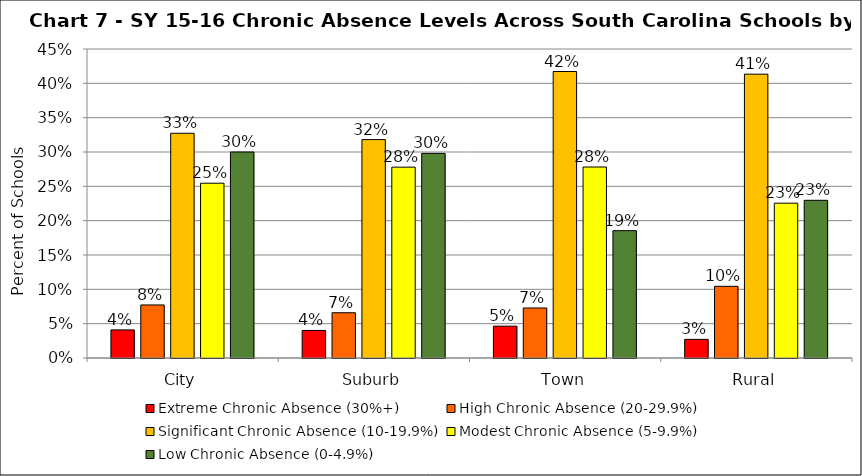
| Category | Extreme Chronic Absence (30%+) | High Chronic Absence (20-29.9%) | Significant Chronic Absence (10-19.9%) | Modest Chronic Absence (5-9.9%) | Low Chronic Absence (0-4.9%) |
|---|---|---|---|---|---|
| 0 | 0.041 | 0.077 | 0.327 | 0.255 | 0.3 |
| 1 | 0.04 | 0.066 | 0.318 | 0.278 | 0.298 |
| 2 | 0.046 | 0.073 | 0.417 | 0.278 | 0.185 |
| 3 | 0.027 | 0.104 | 0.413 | 0.225 | 0.23 |